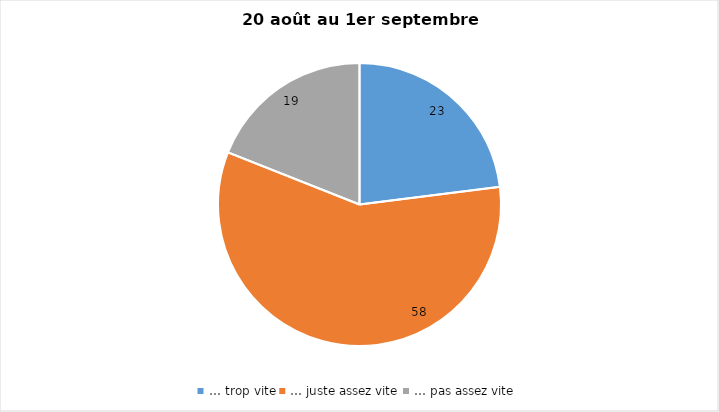
| Category | Series 0 |
|---|---|
| … trop vite | 23 |
| … juste assez vite | 58 |
| … pas assez vite | 19 |